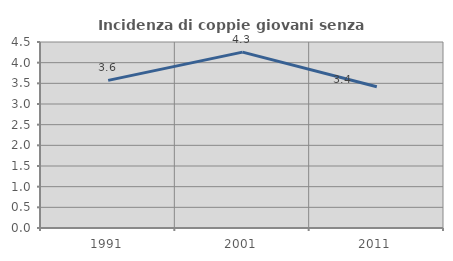
| Category | Incidenza di coppie giovani senza figli |
|---|---|
| 1991.0 | 3.571 |
| 2001.0 | 4.255 |
| 2011.0 | 3.419 |